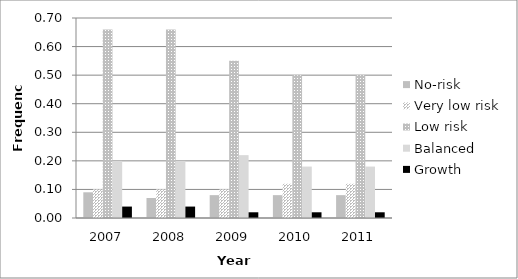
| Category | No-risk | Very low risk | Low risk | Balanced | Growth |
|---|---|---|---|---|---|
| 2007.0 | 0.09 | 0.1 | 0.66 | 0.2 | 0.04 |
| 2008.0 | 0.07 | 0.1 | 0.66 | 0.2 | 0.04 |
| 2009.0 | 0.08 | 0.1 | 0.55 | 0.22 | 0.02 |
| 2010.0 | 0.08 | 0.12 | 0.5 | 0.18 | 0.02 |
| 2011.0 | 0.08 | 0.12 | 0.5 | 0.18 | 0.02 |